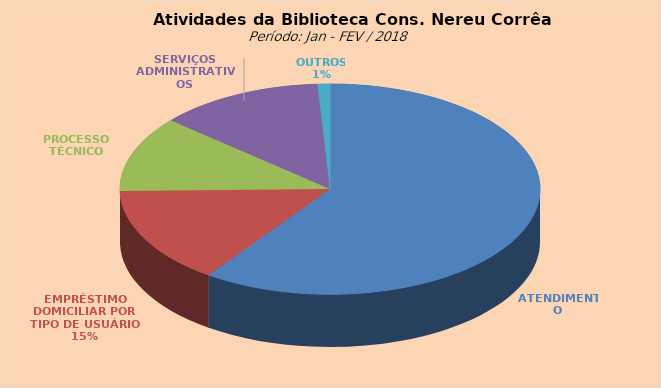
| Category | Series 0 |
|---|---|
| ATENDIMENTO | 1190 |
| EMPRÉSTIMO DOMICILIAR POR TIPO DE USUÁRIO | 297 |
| PROCESSO TÉCNICO | 231 |
| SERVIÇOS ADMINISTRATIVOS | 253 |
| OUTROS | 19 |